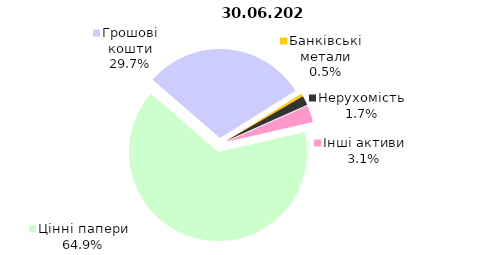
| Category | Всього |
|---|---|
| Цінні папери | 1342.281 |
| Грошові кошти | 614.713 |
| Банківські метали | 10.719 |
| Нерухомість | 35.947 |
| Інші активи | 63.093 |